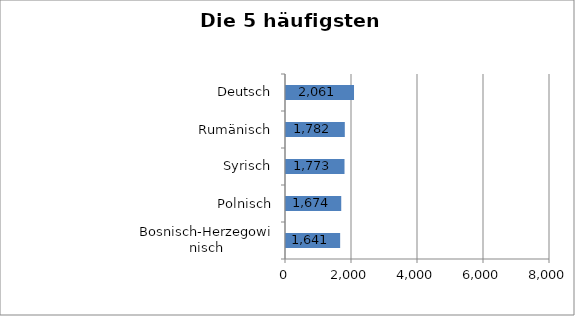
| Category | Series 0 |
|---|---|
| Bosnisch-Herzegowinisch | 1641 |
| Polnisch | 1674 |
| Syrisch | 1773 |
| Rumänisch | 1782 |
| Deutsch | 2061 |